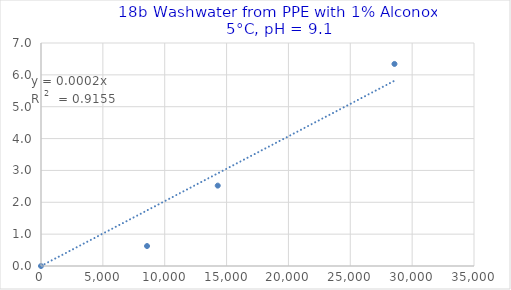
| Category | Series 0 |
|---|---|
| 0.0 | 0 |
| 8571.428571428572 | 0.626 |
| 14285.714285714286 | 2.523 |
| 28571.428571428572 | 6.342 |